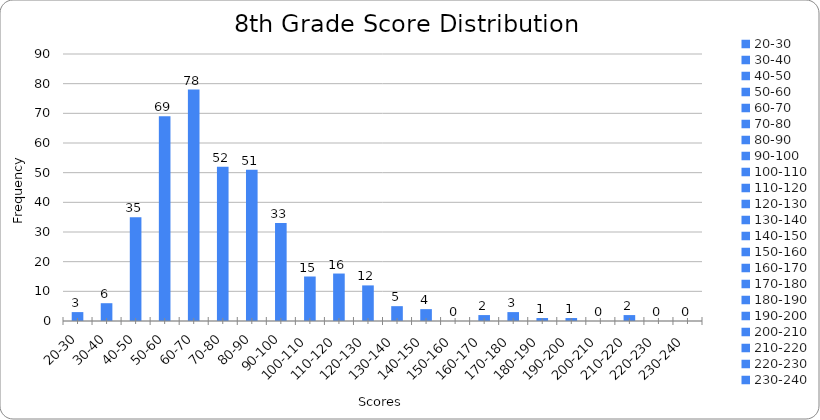
| Category | 0 |
|---|---|
| 20-30 | 3 |
| 30-40 | 6 |
| 40-50 | 35 |
| 50-60 | 69 |
| 60-70 | 78 |
| 70-80 | 52 |
| 80-90 | 51 |
| 90-100 | 33 |
| 100-110 | 15 |
| 110-120 | 16 |
| 120-130 | 12 |
| 130-140 | 5 |
| 140-150 | 4 |
| 150-160 | 0 |
| 160-170 | 2 |
| 170-180 | 3 |
| 180-190 | 1 |
| 190-200 | 1 |
| 200-210 | 0 |
| 210-220 | 2 |
| 220-230 | 0 |
| 230-240 | 0 |